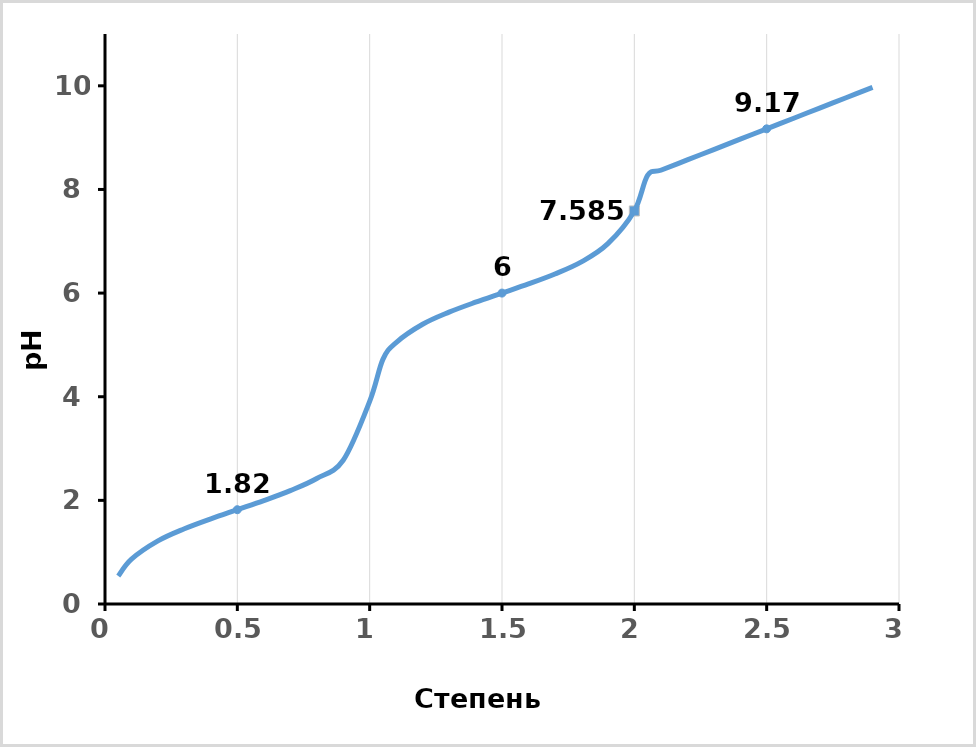
| Category | pH |
|---|---|
| 0.05 | 0.541 |
| 0.1 | 0.866 |
| 0.2 | 1.218 |
| 0.3 | 1.452 |
| 0.4 | 1.644 |
| 0.5 | 1.82 |
| 0.6 | 1.996 |
| 0.7 | 2.188 |
| 0.8 | 2.422 |
| 0.9 | 2.774 |
| 1.0 | 3.91 |
| 1.05 | 4.721 |
| 1.1 | 5.046 |
| 1.2 | 5.398 |
| 1.3 | 5.632 |
| 1.4 | 5.824 |
| 1.5 | 6 |
| 1.6 | 6.176 |
| 1.7 | 6.368 |
| 1.8 | 6.602 |
| 1.9 | 6.954 |
| 2.0 | 7.585 |
| 2.05 | 8.27 |
| 2.1 | 8.37 |
| 2.2 | 8.57 |
| 2.3 | 8.77 |
| 2.4 | 8.97 |
| 2.5 | 9.17 |
| 2.6 | 9.37 |
| 2.7 | 9.57 |
| 2.8 | 9.77 |
| 2.9 | 9.97 |